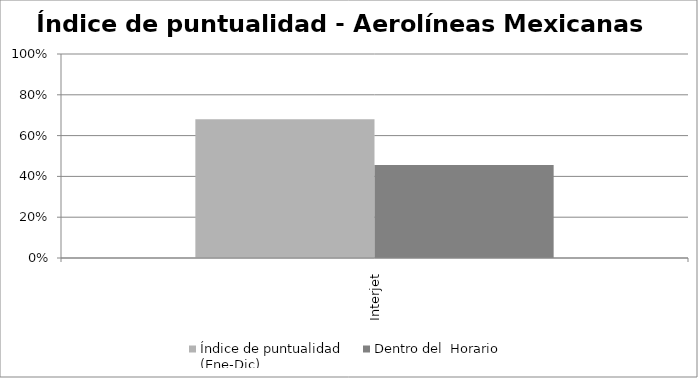
| Category | Índice de puntualidad
(Ene-Dic) | Dentro del  Horario |
|---|---|---|
| Interjet | 0.68 | 0.456 |